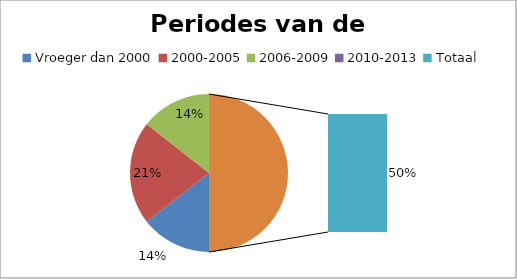
| Category | Aantal |
|---|---|
| Vroeger dan 2000 | 13 |
| 2000-2005 | 19 |
| 2006-2009 | 13 |
| 2010-2013 | 0 |
| Totaal | 45 |